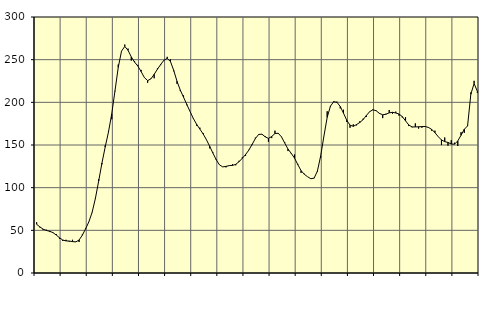
| Category | Piggar | Series 1 |
|---|---|---|
| nan | 59.4 | 57.1 |
| 87.0 | 53.4 | 54 |
| 87.0 | 50.4 | 51.34 |
| 87.0 | 50.7 | 49.83 |
| nan | 48 | 48.89 |
| 88.0 | 47 | 47.31 |
| 88.0 | 45.7 | 44.5 |
| 88.0 | 40 | 41.32 |
| nan | 37.5 | 38.69 |
| 89.0 | 38.9 | 37.6 |
| 89.0 | 36.7 | 37.46 |
| 89.0 | 38.9 | 36.82 |
| nan | 36.8 | 36.45 |
| 90.0 | 36.3 | 38.65 |
| 90.0 | 45.2 | 44.31 |
| 90.0 | 52.5 | 51.79 |
| nan | 60.1 | 59.98 |
| 91.0 | 70.8 | 71.1 |
| 91.0 | 86.9 | 87.43 |
| 91.0 | 109.9 | 107.69 |
| nan | 127.3 | 128.75 |
| 92.0 | 149.5 | 147.6 |
| 92.0 | 166.2 | 165.13 |
| 92.0 | 180.2 | 186.42 |
| nan | 212.9 | 213.53 |
| 93.0 | 244.3 | 241 |
| 93.0 | 259.8 | 259.98 |
| 93.0 | 267.7 | 265.51 |
| nan | 263 | 260.98 |
| 94.0 | 248.9 | 253.2 |
| 94.0 | 248.2 | 247.12 |
| 94.0 | 243.9 | 242.51 |
| nan | 238 | 236.09 |
| 95.0 | 229.3 | 229.07 |
| 95.0 | 222.9 | 225.51 |
| 95.0 | 227.8 | 227.44 |
| nan | 228.2 | 232.83 |
| 96.0 | 239.9 | 238.79 |
| 96.0 | 243.6 | 244.38 |
| 96.0 | 248.9 | 249.34 |
| nan | 253.3 | 251.56 |
| 97.0 | 250.3 | 247.75 |
| 97.0 | 236.4 | 237.29 |
| 97.0 | 221.7 | 224.7 |
| nan | 213.2 | 214.38 |
| 98.0 | 208.1 | 205.99 |
| 98.0 | 196.6 | 197.57 |
| 98.0 | 189.1 | 189.17 |
| nan | 180.6 | 181.09 |
| 99.0 | 172.7 | 174.29 |
| 99.0 | 170.3 | 168.63 |
| 99.0 | 164 | 162.97 |
| nan | 156.5 | 156.24 |
| 0.0 | 146.1 | 148.51 |
| 0.0 | 141.2 | 140.48 |
| 0.0 | 133.4 | 132.79 |
| nan | 126.8 | 126.73 |
| 1.0 | 124.3 | 124.33 |
| 1.0 | 123.8 | 124.94 |
| 1.0 | 126.1 | 125.85 |
| nan | 127.5 | 126.11 |
| 2.0 | 126.2 | 127.32 |
| 2.0 | 131.5 | 130.41 |
| 2.0 | 135.6 | 134.45 |
| nan | 137.2 | 138.81 |
| 3.0 | 144.3 | 144 |
| 3.0 | 149.9 | 150.64 |
| 3.0 | 158.6 | 157.56 |
| nan | 162.6 | 162.3 |
| 4.0 | 162.4 | 162.73 |
| 4.0 | 160.4 | 159.62 |
| 4.0 | 153.7 | 157.74 |
| nan | 158.1 | 159.94 |
| 5.0 | 166.8 | 163.44 |
| 5.0 | 163.3 | 163.79 |
| 5.0 | 159.3 | 159.52 |
| nan | 153.2 | 152.23 |
| 6.0 | 142.9 | 145.25 |
| 6.0 | 139.6 | 140.18 |
| 6.0 | 138.9 | 134.62 |
| nan | 127.8 | 127 |
| 7.0 | 117.3 | 119.97 |
| 7.0 | 116.3 | 115.65 |
| 7.0 | 112.8 | 112.78 |
| nan | 110.2 | 110.45 |
| 8.0 | 111 | 111.22 |
| 8.0 | 118.7 | 119.33 |
| 8.0 | 135.2 | 137.14 |
| nan | 160.5 | 160.45 |
| 9.0 | 189.5 | 182.44 |
| 9.0 | 194.7 | 195.59 |
| 9.0 | 201.4 | 200.7 |
| nan | 200.8 | 200.02 |
| 10.0 | 192.9 | 195.12 |
| 10.0 | 191.3 | 187.27 |
| 10.0 | 177 | 178.97 |
| nan | 170.2 | 173.21 |
| 11.0 | 174.2 | 171.9 |
| 11.0 | 173 | 173.95 |
| 11.0 | 177.8 | 176.44 |
| nan | 180.8 | 179.76 |
| 12.0 | 182.8 | 184.59 |
| 12.0 | 189.3 | 189.02 |
| 12.0 | 191.8 | 191.27 |
| nan | 189.8 | 190.14 |
| 13.0 | 187.5 | 187.06 |
| 13.0 | 181.5 | 185.39 |
| 13.0 | 186.6 | 186.05 |
| nan | 191 | 187.69 |
| 14.0 | 186.6 | 188.34 |
| 14.0 | 189.1 | 187.51 |
| 14.0 | 184.4 | 186.32 |
| nan | 182.3 | 183.34 |
| 15.0 | 182.6 | 178.28 |
| 15.0 | 172.2 | 173.46 |
| 15.0 | 170.7 | 171.17 |
| nan | 175.3 | 171.18 |
| 16.0 | 169.2 | 171.35 |
| 16.0 | 170.2 | 171.58 |
| 16.0 | 172.2 | 171.67 |
| nan | 170.2 | 170.59 |
| 17.0 | 166.7 | 168.32 |
| 17.0 | 166.8 | 164.49 |
| 17.0 | 159.7 | 159.83 |
| nan | 149.9 | 155.94 |
| 18.0 | 158.8 | 153.93 |
| 18.0 | 149.2 | 153 |
| 18.0 | 155.6 | 151.14 |
| nan | 152.7 | 150.96 |
| 19.0 | 148.8 | 154.79 |
| 19.0 | 165 | 161.39 |
| 19.0 | 164.3 | 168.45 |
| nan | 172.8 | 172.33 |
| 20.0 | 211.5 | 209.44 |
| 20.0 | 225.2 | 222.16 |
| 20.0 | 211.1 | 212.87 |